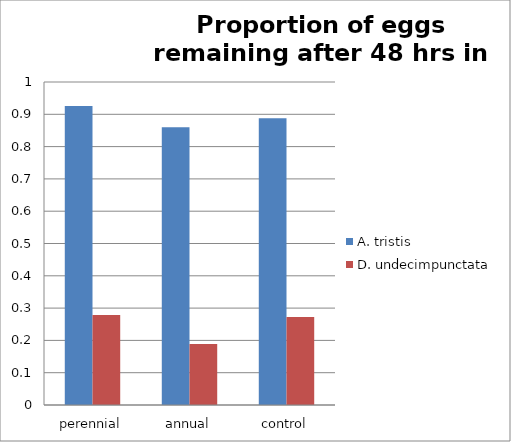
| Category | A. tristis | D. undecimpunctata |
|---|---|---|
| perennial | 0.926 | 0.279 |
| annual | 0.86 | 0.188 |
| control | 0.888 | 0.273 |